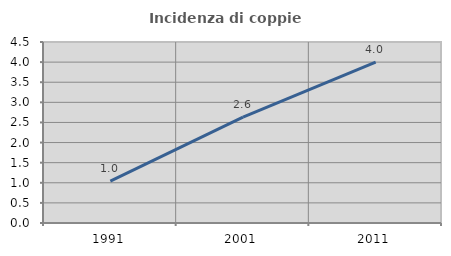
| Category | Incidenza di coppie miste |
|---|---|
| 1991.0 | 1.039 |
| 2001.0 | 2.632 |
| 2011.0 | 4 |